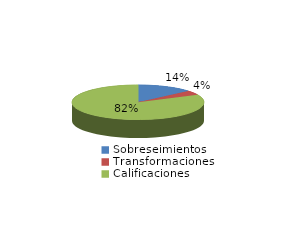
| Category | Series 0 |
|---|---|
| Sobreseimientos | 249 |
| Transformaciones | 75 |
| Calificaciones | 1499 |